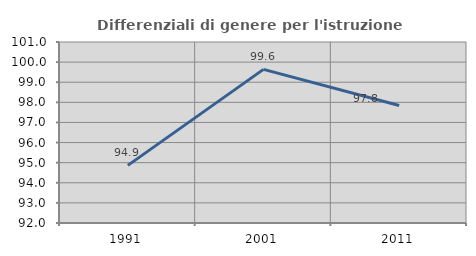
| Category | Differenziali di genere per l'istruzione superiore |
|---|---|
| 1991.0 | 94.866 |
| 2001.0 | 99.64 |
| 2011.0 | 97.845 |